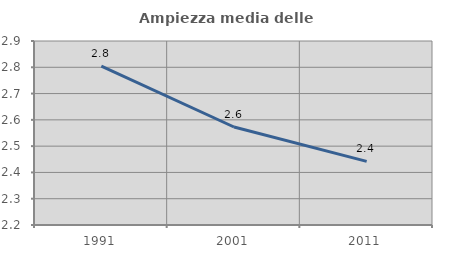
| Category | Ampiezza media delle famiglie |
|---|---|
| 1991.0 | 2.805 |
| 2001.0 | 2.573 |
| 2011.0 | 2.442 |